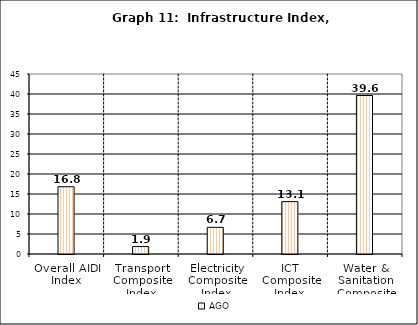
| Category | Series 0 | AGO | Series 2 |
|---|---|---|---|
| Overall AIDI Index |  | 16.81 |  |
| Transport Composite Index |  | 1.859 |  |
| Electricity Composite Index |  | 6.667 |  |
| ICT Composite Index  |  | 13.092 |  |
| Water & Sanitation Composite Index |  | 39.617 |  |